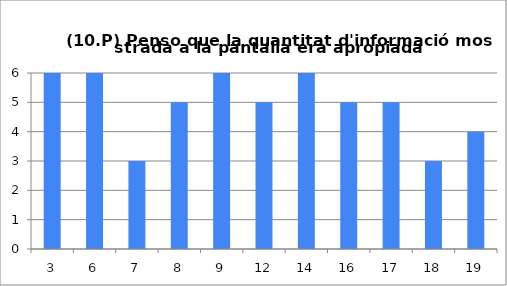
| Category | 10 |
|---|---|
| 3.0 | 6 |
| 6.0 | 6 |
| 7.0 | 3 |
| 8.0 | 5 |
| 9.0 | 6 |
| 12.0 | 5 |
| 14.0 | 6 |
| 16.0 | 5 |
| 17.0 | 5 |
| 18.0 | 3 |
| 19.0 | 4 |